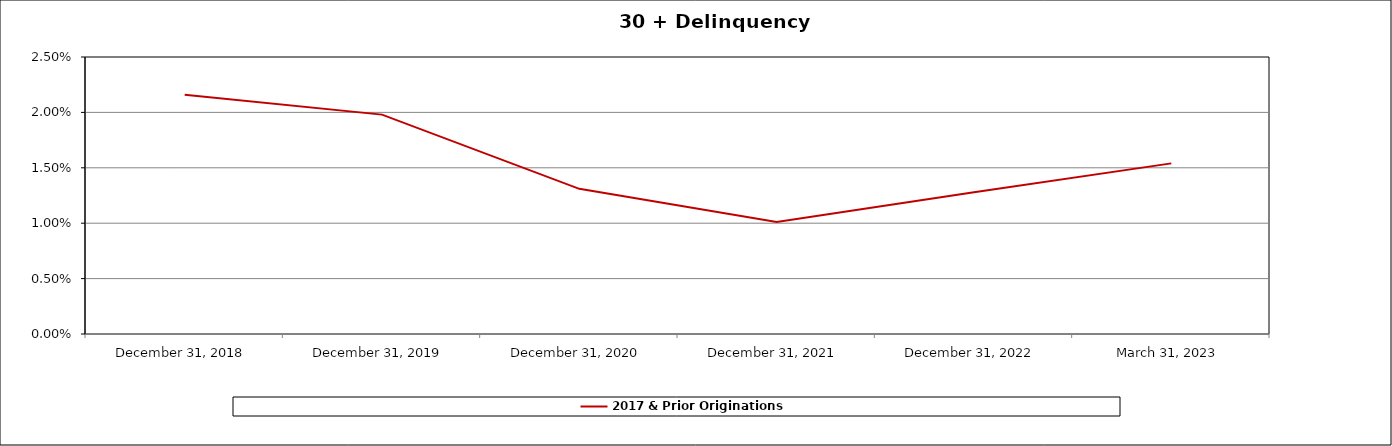
| Category | 2017 & Prior Originations |
|---|---|
| 2018-12-31 | 0.022 |
| 2019-12-31 | 0.02 |
| 2020-12-31 | 0.013 |
| 2021-12-31 | 0.01 |
| 2022-12-31 | 0.013 |
| 2023-03-31 | 0.015 |